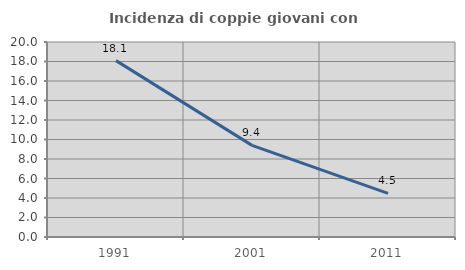
| Category | Incidenza di coppie giovani con figli |
|---|---|
| 1991.0 | 18.088 |
| 2001.0 | 9.397 |
| 2011.0 | 4.476 |